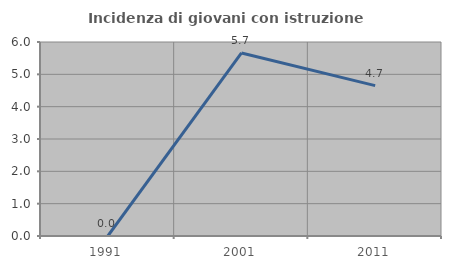
| Category | Incidenza di giovani con istruzione universitaria |
|---|---|
| 1991.0 | 0 |
| 2001.0 | 5.66 |
| 2011.0 | 4.651 |